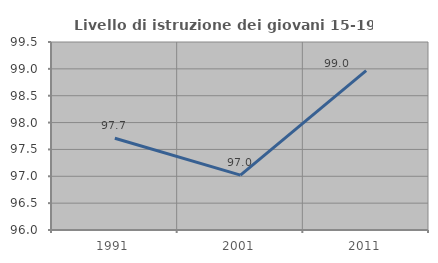
| Category | Livello di istruzione dei giovani 15-19 anni |
|---|---|
| 1991.0 | 97.708 |
| 2001.0 | 97.021 |
| 2011.0 | 98.966 |